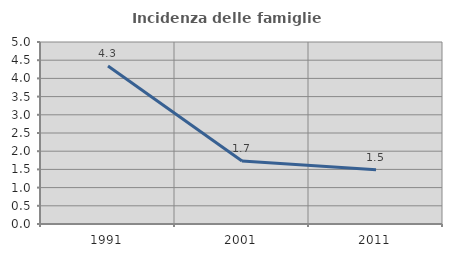
| Category | Incidenza delle famiglie numerose |
|---|---|
| 1991.0 | 4.34 |
| 2001.0 | 1.729 |
| 2011.0 | 1.491 |